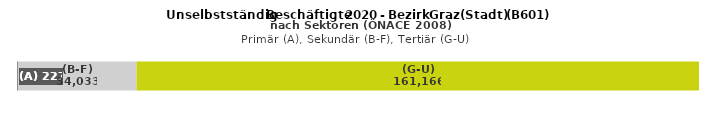
| Category | (A) | (B-F) | (G-U) |
|---|---|---|---|
| 0 | 227 | 34033 | 161166 |